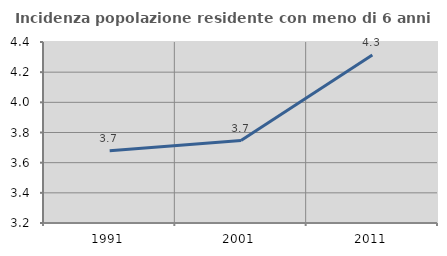
| Category | Incidenza popolazione residente con meno di 6 anni |
|---|---|
| 1991.0 | 3.679 |
| 2001.0 | 3.746 |
| 2011.0 | 4.314 |